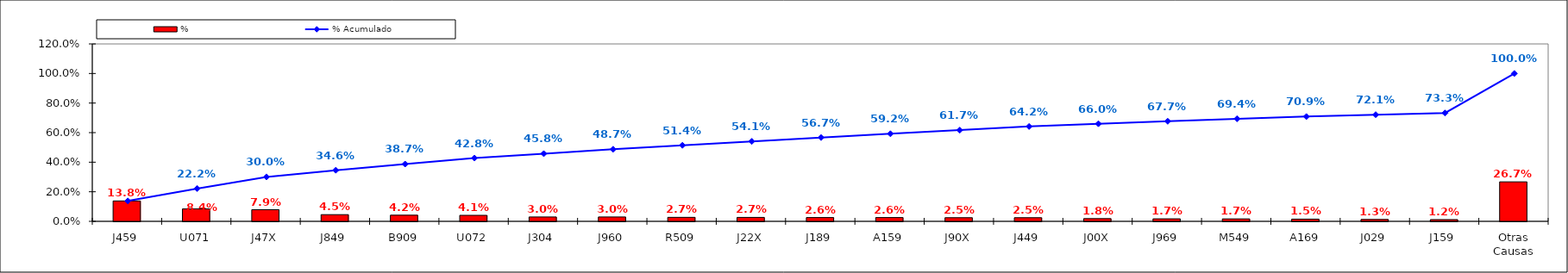
| Category | % |
|---|---|
| J459 | 0.138 |
| U071 | 0.084 |
| J47X | 0.079 |
| J849 | 0.045 |
| B909 | 0.042 |
| U072 | 0.041 |
| J304 | 0.03 |
| J960 | 0.03 |
| R509 | 0.027 |
| J22X | 0.027 |
| J189 | 0.026 |
| A159 | 0.026 |
| J90X | 0.025 |
| J449 | 0.025 |
| J00X | 0.018 |
| J969 | 0.017 |
| M549 | 0.017 |
| A169 | 0.015 |
| J029 | 0.013 |
| J159 | 0.012 |
| Otras Causas | 0.267 |